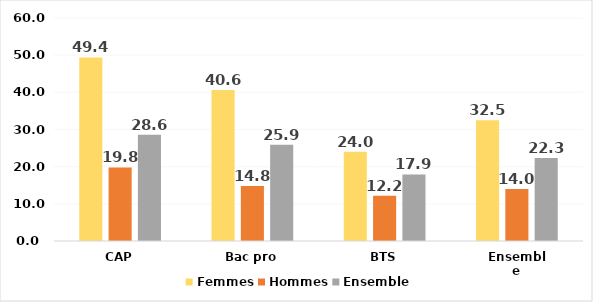
| Category | Femmes | Hommes | Ensemble |
|---|---|---|---|
| CAP | 49.4 | 19.8 | 28.6 |
| Bac pro | 40.6 | 14.8 | 25.9 |
| BTS | 24 | 12.2 | 17.9 |
| Ensemble | 32.5 | 14 | 22.3 |